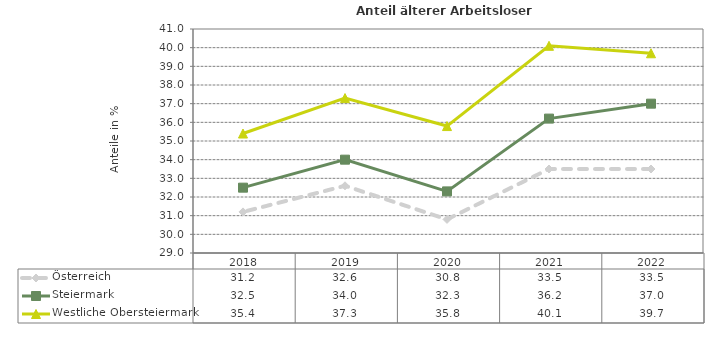
| Category | Österreich | Steiermark | Westliche Obersteiermark |
|---|---|---|---|
| 2022.0 | 33.5 | 37 | 39.7 |
| 2021.0 | 33.5 | 36.2 | 40.1 |
| 2020.0 | 30.8 | 32.3 | 35.8 |
| 2019.0 | 32.6 | 34 | 37.3 |
| 2018.0 | 31.2 | 32.5 | 35.4 |